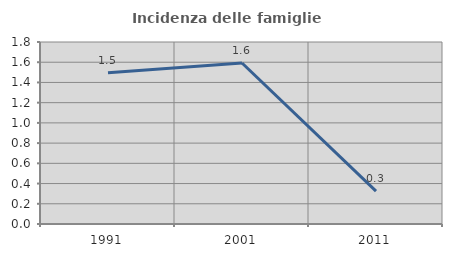
| Category | Incidenza delle famiglie numerose |
|---|---|
| 1991.0 | 1.497 |
| 2001.0 | 1.592 |
| 2011.0 | 0.325 |